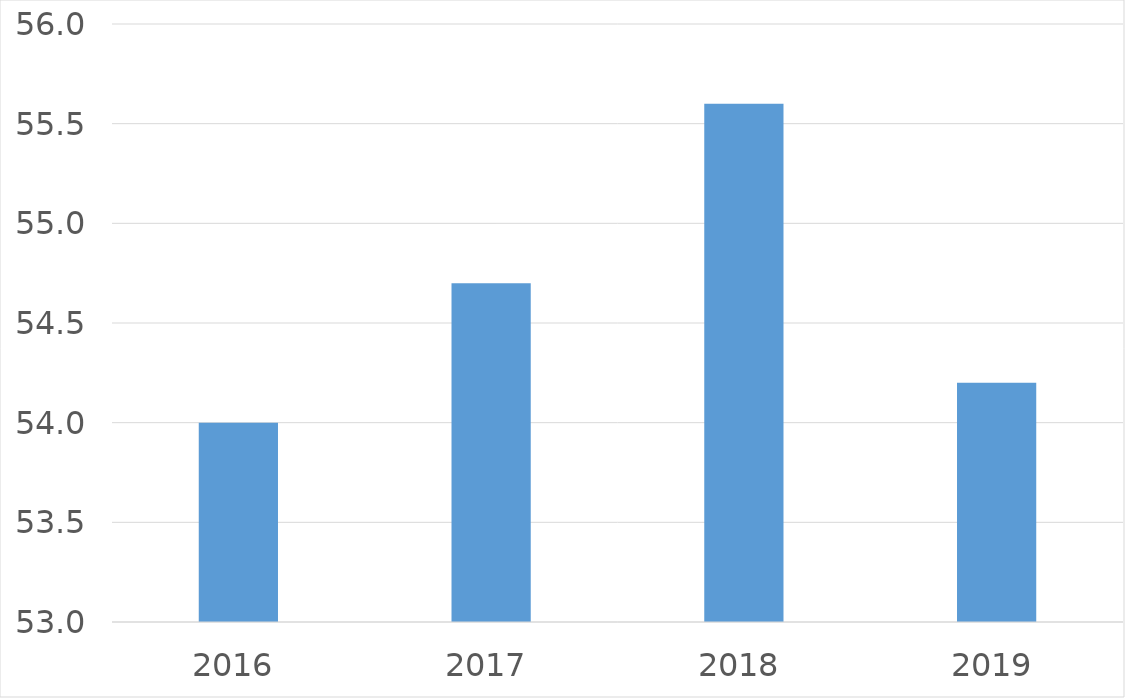
| Category | Series 0 |
|---|---|
| 2016 | 54 |
| 2017 | 54.7 |
| 2018 | 55.6 |
| 2019 | 54.2 |